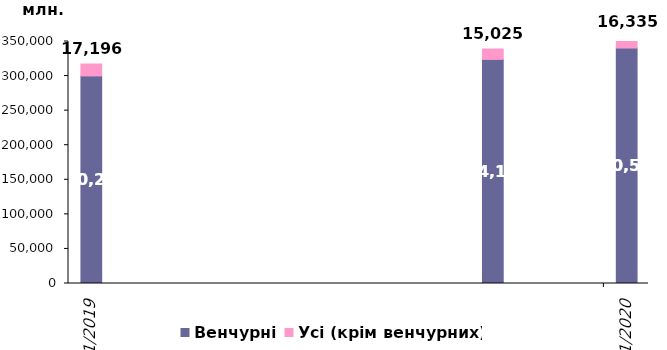
| Category | Венчурні | Усі (крім венчурних) |
|---|---|---|
| 3/31/19 | 300241.731 | 17195.754 |
| 12/31/19 | 324105.005 | 15024.795 |
| 3/31/20 | 340549.472 | 16334.801 |